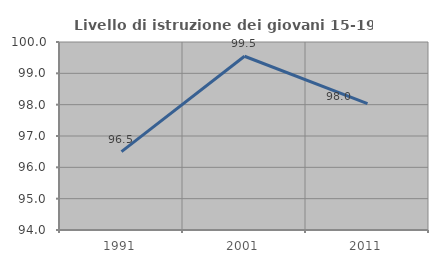
| Category | Livello di istruzione dei giovani 15-19 anni |
|---|---|
| 1991.0 | 96.501 |
| 2001.0 | 99.545 |
| 2011.0 | 98.031 |